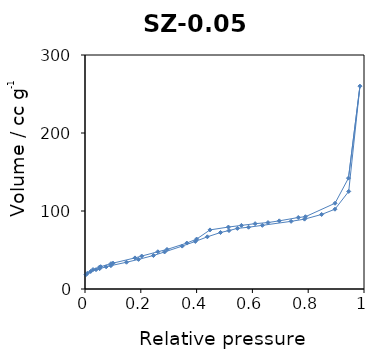
| Category | Series 0 |
|---|---|
| 0.003186 | 18.197 |
| 0.008603 | 20.177 |
| 0.020341 | 22.453 |
| 0.039554 | 24.79 |
| 0.052386 | 26.074 |
| 0.075821 | 28.416 |
| 0.092809 | 29.935 |
| 0.14878 | 34.305 |
| 0.191847 | 37.944 |
| 0.245312 | 42.938 |
| 0.285217 | 47.484 |
| 0.348371 | 54.993 |
| 0.395587 | 61.005 |
| 0.43854 | 66.904 |
| 0.485724 | 72.42 |
| 0.516162 | 74.915 |
| 0.546325 | 77.707 |
| 0.586163 | 79.203 |
| 0.635686 | 81.6 |
| 0.738741 | 86.72 |
| 0.786857 | 89.579 |
| 0.848088 | 95.591 |
| 0.895917 | 102.294 |
| 0.945204 | 125.088 |
| 0.985443 | 260.056 |
| 0.944386 | 142.154 |
| 0.896195 | 109.946 |
| 0.790125 | 92.683 |
| 0.764427 | 91.663 |
| 0.696391 | 87.367 |
| 0.655887 | 85.178 |
| 0.609747 | 83.76 |
| 0.560702 | 81.544 |
| 0.514024 | 79.421 |
| 0.447991 | 75.747 |
| 0.400161 | 64.023 |
| 0.364982 | 58.888 |
| 0.29396 | 50.697 |
| 0.261031 | 47.737 |
| 0.203245 | 42.246 |
| 0.179129 | 39.87 |
| 0.100384 | 33.143 |
| 0.09329 | 32.496 |
| 0.056046 | 28.611 |
| 0.05243 | 28.136 |
| 0.028787 | 24.947 |